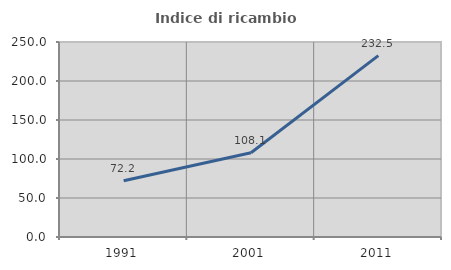
| Category | Indice di ricambio occupazionale  |
|---|---|
| 1991.0 | 72.193 |
| 2001.0 | 108.083 |
| 2011.0 | 232.493 |